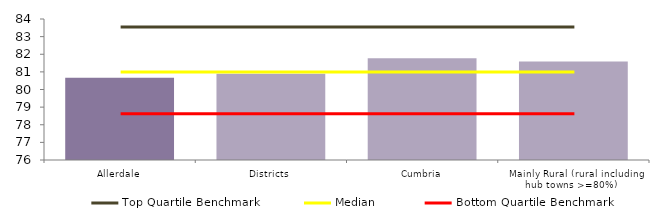
| Category | Block Data |
|---|---|
| Allerdale | 80.665 |
| Districts | 80.893 |
| Cumbria | 81.772 |
|  Mainly Rural (rural including hub towns >=80%)   | 81.586 |